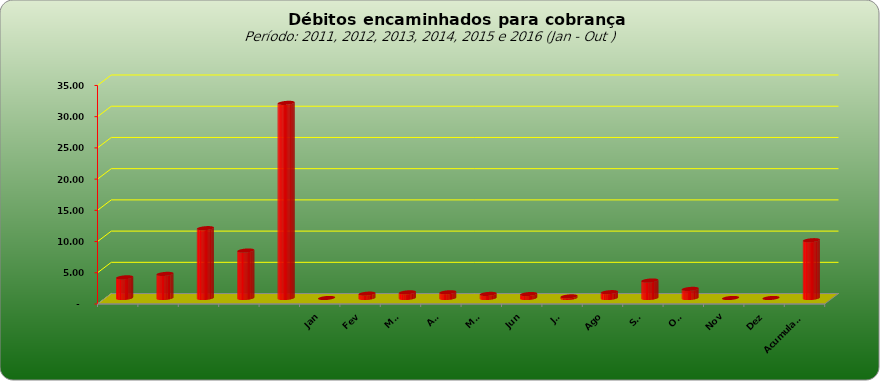
| Category |  3.309.443,02  |
|---|---|
|  | 3309443.02 |
|  | 3859728.44 |
|  | 11181928.25 |
|  | 7600526.01 |
|  | 31248623.5 |
| Jan | 0 |
| Fev | 695716.82 |
| Mar | 906394.22 |
| Abr | 915013.51 |
| Mai | 654375.79 |
| Jun | 631930.49 |
| Jul | 259089.26 |
| Ago | 932827.69 |
| Set | 2800571.52 |
| Out | 1458860.91 |
| Nov | 0 |
| Dez | 0 |
| Acumulado | 9254780.21 |